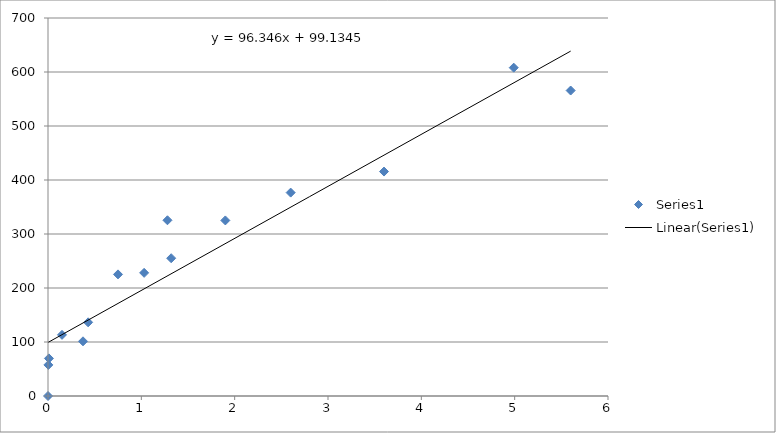
| Category | Series 0 |
|---|---|
| 0.0 | 0 |
| 0.004 | 57.58 |
| 0.01 | 69.62 |
| 0.375 | 101.25 |
| 0.15 | 113.23 |
| 0.43 | 136.41 |
| 0.75 | 225.23 |
| 1.03 | 228.05 |
| 2.6 | 376.66 |
| 3.6 | 415.63 |
| 5.6 | 565.71 |
| 4.99 | 608.01 |
| 1.32 | 255.14 |
| 1.28 | 325.43 |
| 1.9 | 325.13 |